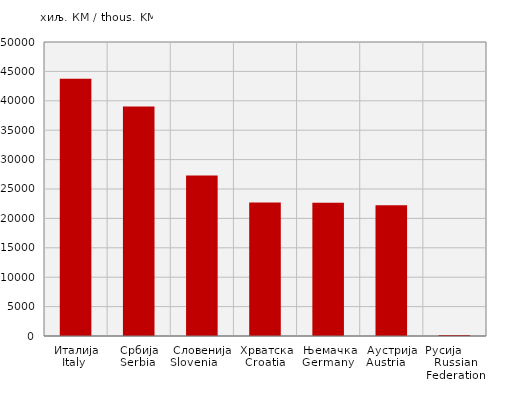
| Category | Извоз
Export |
|---|---|
| Италија
Italy  | 43760 |
| Србија
Serbia  | 39031 |
| Словенија
Slovenia       | 27283 |
| Хрватска
Croatia  | 22701 |
| Њемачка
Germany  | 22662 |
| Аустрија
Austria     | 22251 |
| Русија        Russian Federation | 183 |